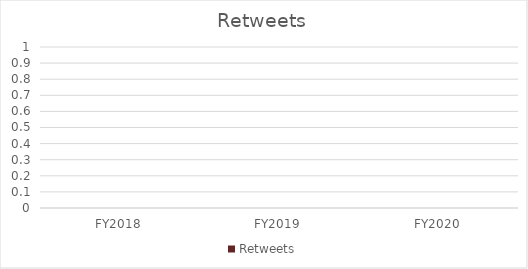
| Category | Retweets |
|---|---|
| FY2018 | 0 |
| FY2019 | 0 |
| FY2020 | 0 |